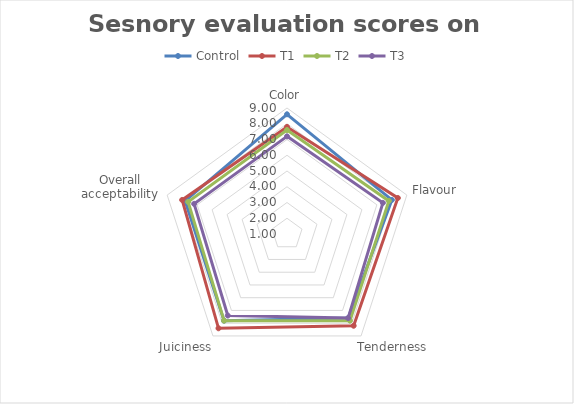
| Category | Control | T1 | T2 | T3 |
|---|---|---|---|---|
| Color | 8.6 | 7.8 | 7.6 | 7.2 |
| Flavour | 8 | 8.4 | 7.8 | 7.4 |
| Tenderness | 7.6 | 8.2 | 7.8 | 7.6 |
| Juiciness | 7.8 | 8.4 | 7.8 | 7.4 |
| Overall acceptability | 7.8 | 8 | 7.6 | 7.2 |